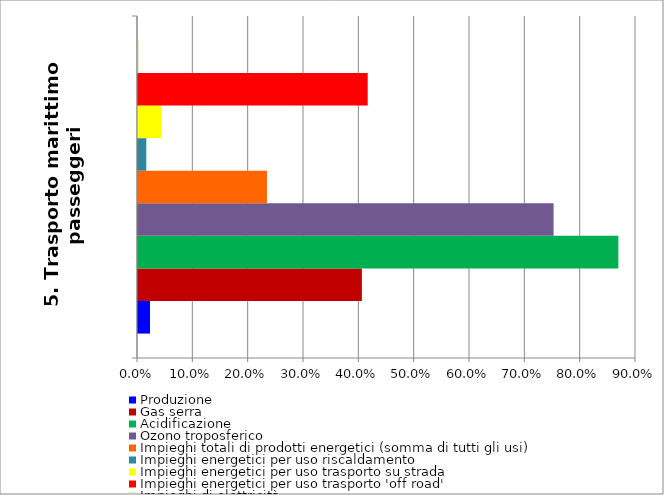
| Category | Produzione | Gas serra | Acidificazione | Ozono troposferico | Impieghi totali di prodotti energetici (somma di tutti gli usi) | Impieghi energetici per uso riscaldamento | Impieghi energetici per uso trasporto su strada | Impieghi energetici per uso trasporto 'off road' | Impieghi di elettricità |
|---|---|---|---|---|---|---|---|---|---|
| 5. Trasporto marittimo passeggeri | 0.022 | 0.405 | 0.868 | 0.751 | 0.233 | 0.015 | 0.043 | 0.415 | 0.001 |